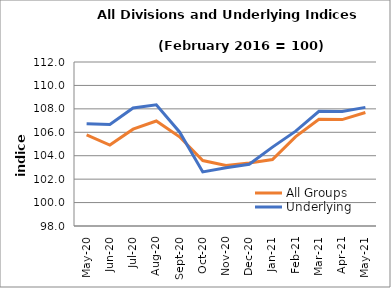
| Category | All Groups | Underlying |
|---|---|---|
| 2020-05-01 | 105.77 | 106.735 |
| 2020-06-01 | 104.913 | 106.661 |
| 2020-07-01 | 106.265 | 108.077 |
| 2020-08-01 | 106.963 | 108.349 |
| 2020-09-01 | 105.614 | 106.027 |
| 2020-10-01 | 103.588 | 102.619 |
| 2020-11-01 | 103.171 | 102.969 |
| 2020-12-01 | 103.378 | 103.266 |
| 2021-01-01 | 103.671 | 104.733 |
| 2021-02-01 | 105.627 | 106.099 |
| 2021-03-01 | 107.11 | 107.788 |
| 2021-04-01 | 107.082 | 107.772 |
| 2021-05-01 | 107.693 | 108.128 |